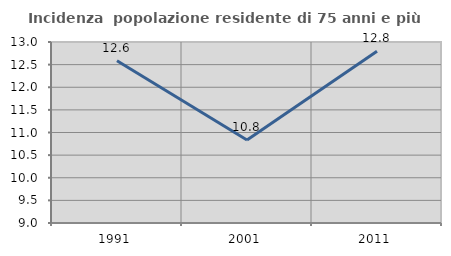
| Category | Incidenza  popolazione residente di 75 anni e più |
|---|---|
| 1991.0 | 12.584 |
| 2001.0 | 10.833 |
| 2011.0 | 12.796 |